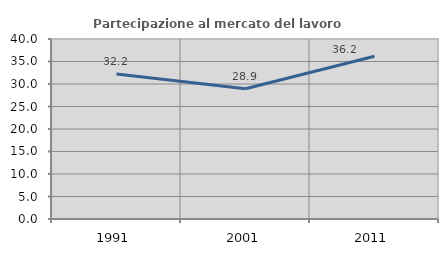
| Category | Partecipazione al mercato del lavoro  femminile |
|---|---|
| 1991.0 | 32.197 |
| 2001.0 | 28.938 |
| 2011.0 | 36.184 |